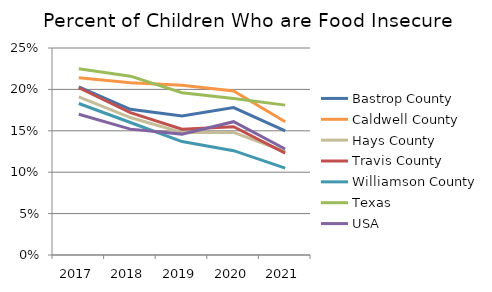
| Category | Bastrop County | Caldwell County | Hays County | Travis County | Williamson County | Texas | USA |
|---|---|---|---|---|---|---|---|
| 2017.0 | 0.203 | 0.214 | 0.191 | 0.202 | 0.183 | 0.225 | 0.17 |
| 2018.0 | 0.176 | 0.208 | 0.166 | 0.172 | 0.16 | 0.216 | 0.152 |
| 2019.0 | 0.168 | 0.205 | 0.148 | 0.152 | 0.137 | 0.196 | 0.146 |
| 2020.0 | 0.178 | 0.198 | 0.148 | 0.155 | 0.126 | 0.189 | 0.161 |
| 2021.0 | 0.15 | 0.161 | 0.125 | 0.123 | 0.105 | 0.181 | 0.128 |